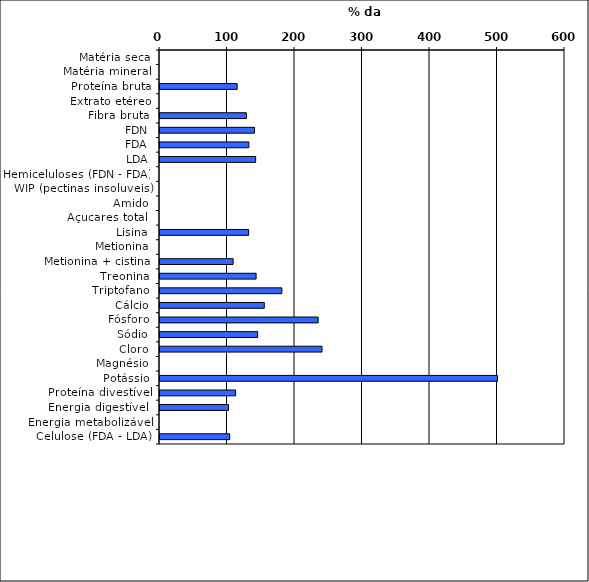
| Category | Series 0 |
|---|---|
| Matéria seca | 0 |
| Matéria mineral | 0 |
| Proteína bruta | 114.286 |
| Extrato etéreo | 0 |
| Fibra bruta | 127.962 |
| FDN | 140 |
| FDA | 131.63 |
| LDA | 141.735 |
| Hemiceluloses (FDN - FDA) | 0 |
| WIP (pectinas insoluveis) | 0 |
| Amido | 0 |
| Açucares total  | 0 |
| Lisina | 131.341 |
| Metionina | 0 |
| Metionina + cistina | 108.29 |
| Treonina | 142.394 |
| Triptofano | 180.526 |
| Cálcio | 154.536 |
| Fósforo | 234.247 |
| Sódio | 144.708 |
| Cloro | 240 |
| Magnésio | 0 |
| Potássio | 500 |
| Proteína divestível | 111.975 |
| Energia digestível  | 101.503 |
| Energia metabolizável | 0 |
| Celulose (FDA - LDA) | 103.283 |